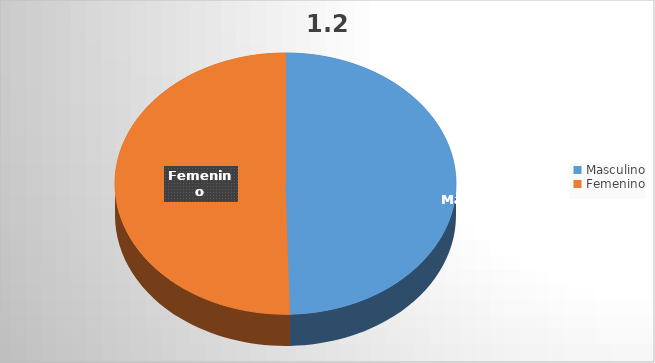
| Category | Series 0 |
|---|---|
| Masculino | 176 |
| Femenino | 179 |